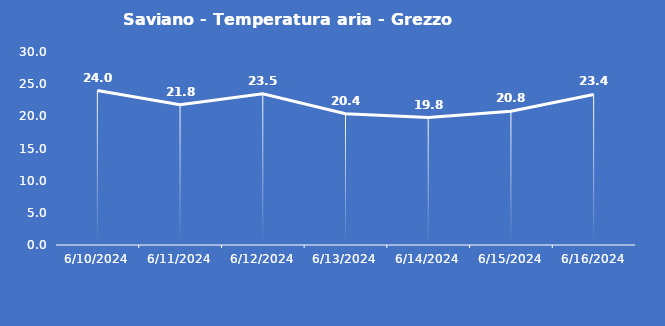
| Category | Saviano - Temperatura aria - Grezzo (°C) |
|---|---|
| 6/10/24 | 24 |
| 6/11/24 | 21.8 |
| 6/12/24 | 23.5 |
| 6/13/24 | 20.4 |
| 6/14/24 | 19.8 |
| 6/15/24 | 20.8 |
| 6/16/24 | 23.4 |